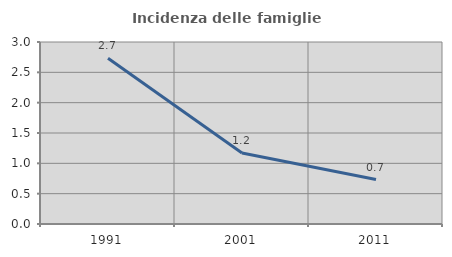
| Category | Incidenza delle famiglie numerose |
|---|---|
| 1991.0 | 2.733 |
| 2001.0 | 1.171 |
| 2011.0 | 0.733 |